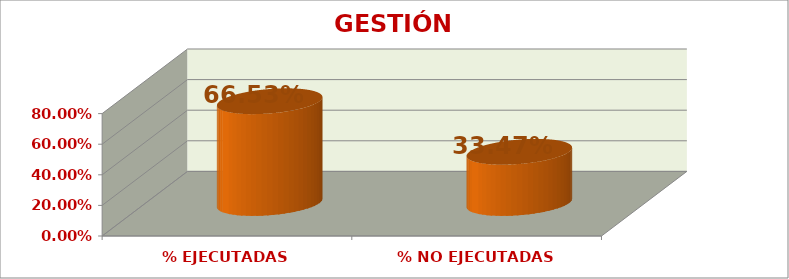
| Category | GESTIÓN DIRECTIVA |
|---|---|
| % EJECUTADAS | 0.665 |
| % NO EJECUTADAS | 0.335 |